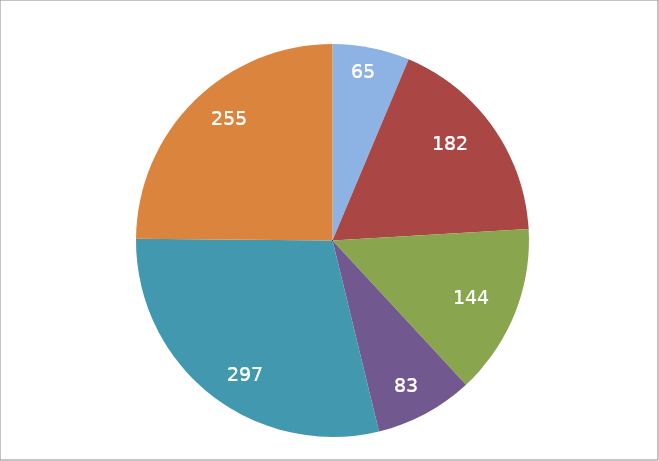
| Category | Series 1 |
|---|---|
| 0 | 65 |
| 1 | 182 |
| 2 | 144 |
| 3 | 83 |
| 4 | 297 |
| 5 | 255 |